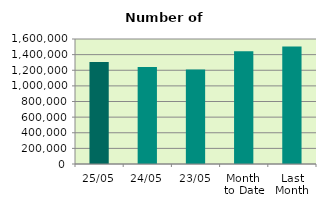
| Category | Series 0 |
|---|---|
| 25/05 | 1304424 |
| 24/05 | 1240720 |
| 23/05 | 1210406 |
| Month 
to Date | 1443017.444 |
| Last
Month | 1505043.474 |